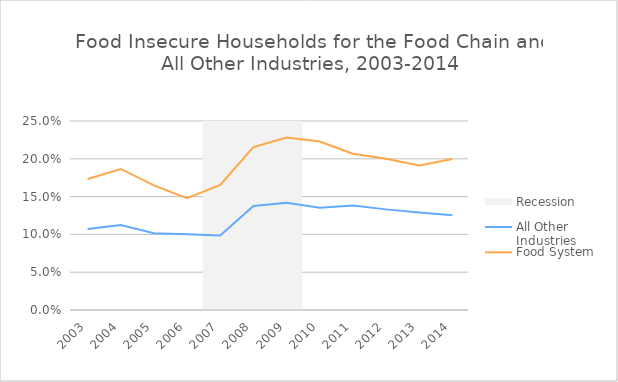
| Category | Recession |
|---|---|
| 2003.0 | 0 |
| 2004.0 | 0 |
| 2005.0 | 0 |
| 2006.0 | 0 |
| 2007.0 | 1 |
| 2008.0 | 1 |
| 2009.0 | 1 |
| 2010.0 | 0 |
| 2011.0 | 0 |
| 2012.0 | 0 |
| 2013.0 | 0 |
| 2014.0 | 0 |